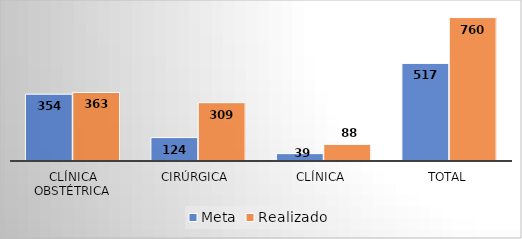
| Category | Meta | Realizado |
|---|---|---|
| Clínica Obstétrica | 354 | 363 |
| Cirúrgica  | 124 | 309 |
| Clínica  | 39 | 88 |
| Total | 517 | 760 |